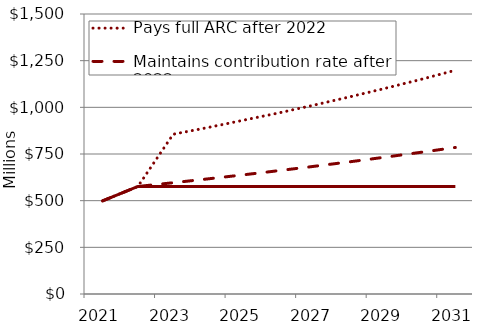
| Category | Pays full ARC after 2022 | Maintains contribution rate after 2022 | Maintains dollar contribution after 2022 |
|---|---|---|---|
| 2021.0 | 499000 | 499000 | 499000 |
| 2022.0 | 576000 | 576000 | 576000 |
| 2023.0 | 855897.625 | 596160 | 576000 |
| 2024.0 | 892387.062 | 617025.625 | 576000 |
| 2025.0 | 931269.875 | 638621.5 | 576000 |
| 2026.0 | 970387.938 | 660973.25 | 576000 |
| 2027.0 | 1012250.625 | 684107.312 | 576000 |
| 2028.0 | 1055962.875 | 708051.062 | 576000 |
| 2029.0 | 1101289 | 732832.875 | 576000 |
| 2030.0 | 1148532.625 | 758482 | 576000 |
| 2031.0 | 1198595.125 | 785028.875 | 576000 |